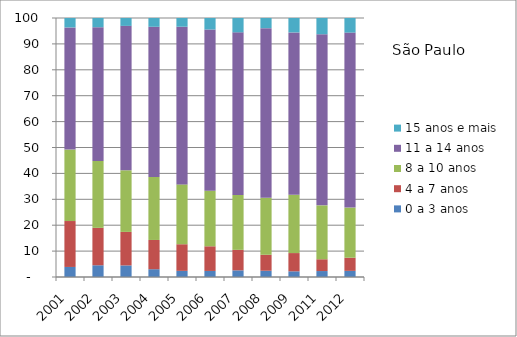
| Category | 0 a 3 anos | 4 a 7 anos | 8 a 10 anos | 11 a 14 anos | 15 anos e mais |
|---|---|---|---|---|---|
| 2001.0 | 3.88 | 17.73 | 27.6 | 47.15 | 3.64 |
| 2002.0 | 4.53 | 14.45 | 25.82 | 51.64 | 3.57 |
| 2003.0 | 4.47 | 12.94 | 23.79 | 55.76 | 3.04 |
| 2004.0 | 3.01 | 11.29 | 24.3 | 58.01 | 3.38 |
| 2005.0 | 2.37 | 10.28 | 23.11 | 60.87 | 3.37 |
| 2006.0 | 2.34 | 9.52 | 21.45 | 62.25 | 4.44 |
| 2007.0 | 2.57 | 7.91 | 21.21 | 62.77 | 5.53 |
| 2008.0 | 2.42 | 6.16 | 21.99 | 65.51 | 3.91 |
| 2009.0 | 2.2 | 7.04 | 22.5 | 62.69 | 5.57 |
| 2011.0 | 2.3 | 4.55 | 20.81 | 66.07 | 6.28 |
| 2012.0 | 2.37 | 5.08 | 19.35 | 67.57 | 5.63 |